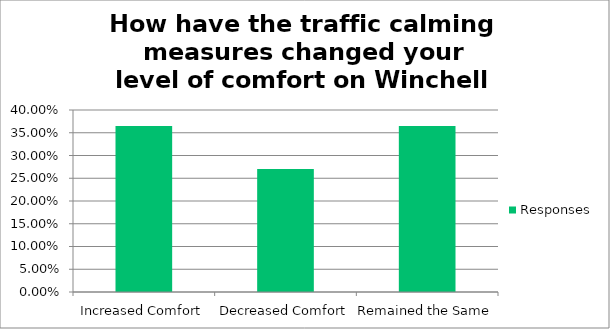
| Category | Responses |
|---|---|
| Increased Comfort | 0.365 |
| Decreased Comfort | 0.27 |
| Remained the Same | 0.365 |